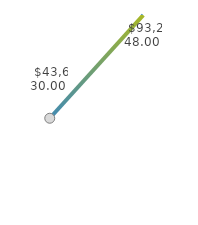
| Category | Series 1 |
|---|---|
| 0 | 43630 |
| 1 | 93248 |